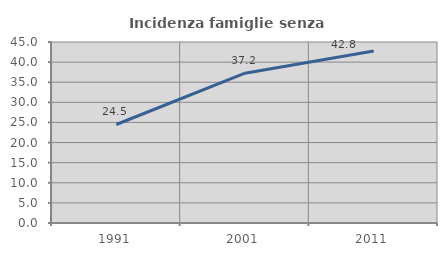
| Category | Incidenza famiglie senza nuclei |
|---|---|
| 1991.0 | 24.49 |
| 2001.0 | 37.248 |
| 2011.0 | 42.759 |